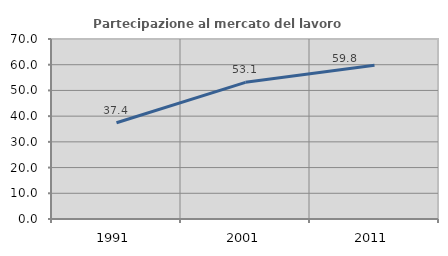
| Category | Partecipazione al mercato del lavoro  femminile |
|---|---|
| 1991.0 | 37.416 |
| 2001.0 | 53.14 |
| 2011.0 | 59.8 |